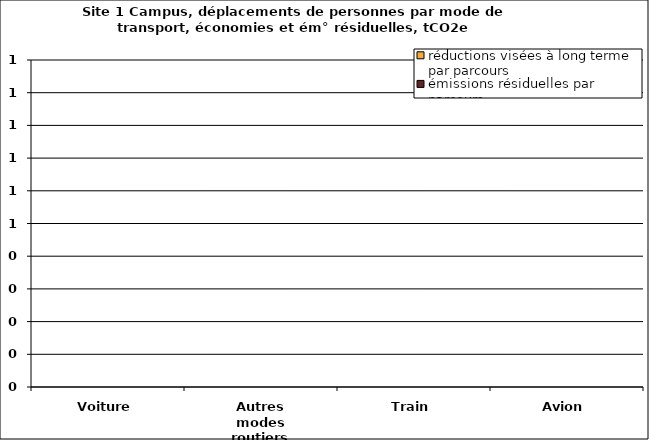
| Category | émissions résiduelles par parcours | réductions visées à long terme par parcours |
|---|---|---|
| Voiture | 0 | 0 |
| Autres modes routiers | 0 | 0 |
| Train | 0 | 0 |
| Avion | 0 | 0 |